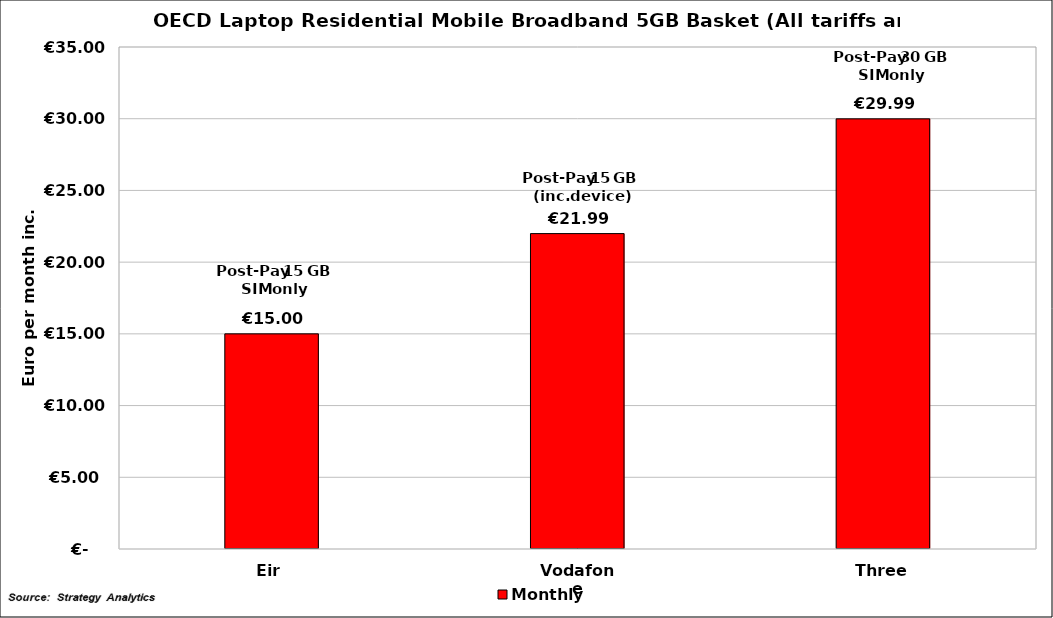
| Category | Non-rec | Monthly | Usage |
|---|---|---|---|
| Eir | 0 | 15 | 0 |
| Vodafone | 0 | 21.99 | 0 |
| Three | 0 | 29.99 | 0 |